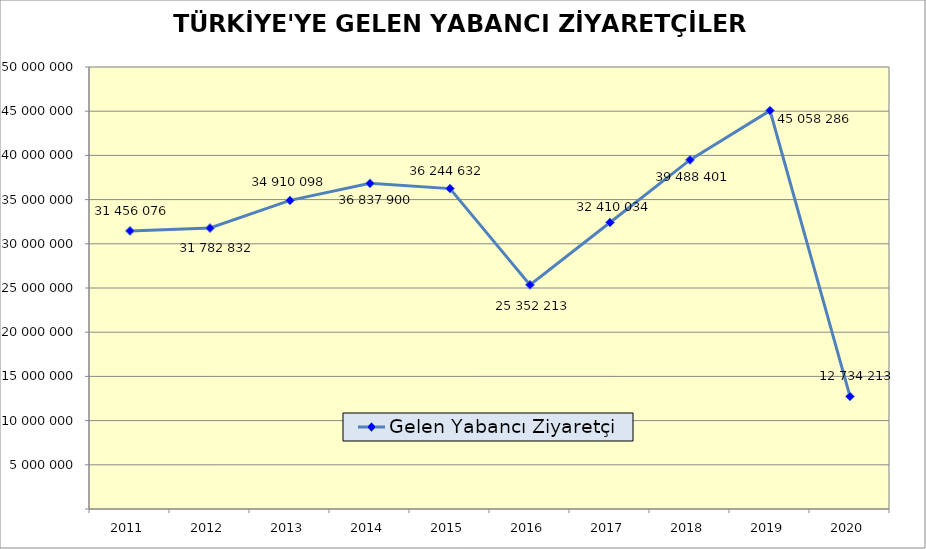
| Category | Gelen Yabancı Ziyaretçi |
|---|---|
| 2011.0 | 31456076 |
| 2012.0 | 31782832 |
| 2013.0 | 34910098 |
| 2014.0 | 36837900 |
| 2015.0 | 36244632 |
| 2016.0 | 25352213 |
| 2017.0 | 32410034 |
| 2018.0 | 39488401 |
| 2019.0 | 45058286 |
| 2020.0 | 12734213 |